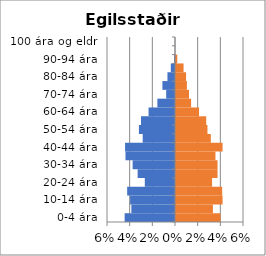
| Category | % karlar | %konur |
|---|---|---|
| 0-4 ára | -0.044 | 0.039 |
| 5-9 ára | -0.039 | 0.033 |
| 10-14 ára | -0.04 | 0.041 |
| 15-19 ára | -0.042 | 0.041 |
| 20-24 ára | -0.027 | 0.032 |
| 25-29 ára | -0.033 | 0.037 |
| 30-34 ára | -0.037 | 0.037 |
| 35-39 ára | -0.044 | 0.035 |
| 40-44 ára | -0.044 | 0.041 |
| 45-49 ára | -0.029 | 0.031 |
| 50-54 ára | -0.032 | 0.028 |
| 55-59 ára | -0.03 | 0.027 |
| 60-64 ára | -0.023 | 0.02 |
| 65-69 ára | -0.016 | 0.013 |
| 70-74 ára | -0.008 | 0.011 |
| 75-79 ára | -0.011 | 0.01 |
| 80-84 ára | -0.007 | 0.009 |
| 85-89 ára | -0.004 | 0.007 |
| 90-94 ára | -0.001 | 0.001 |
| 95-99 ára | 0 | 0 |
| 100 ára og eldri | 0 | 0 |